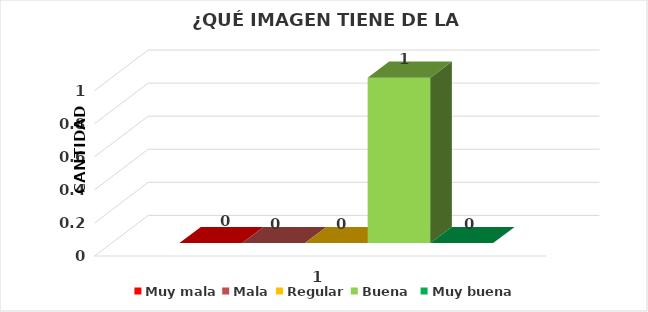
| Category | Muy mala | Mala | Regular | Buena  | Muy buena |
|---|---|---|---|---|---|
| 0 | 0 | 0 | 0 | 1 | 0 |